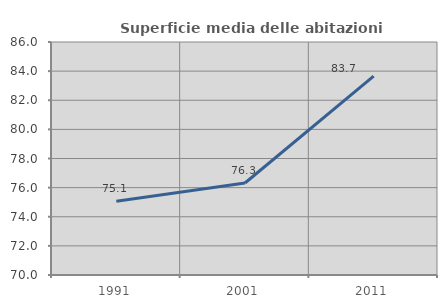
| Category | Superficie media delle abitazioni occupate |
|---|---|
| 1991.0 | 75.058 |
| 2001.0 | 76.317 |
| 2011.0 | 83.66 |